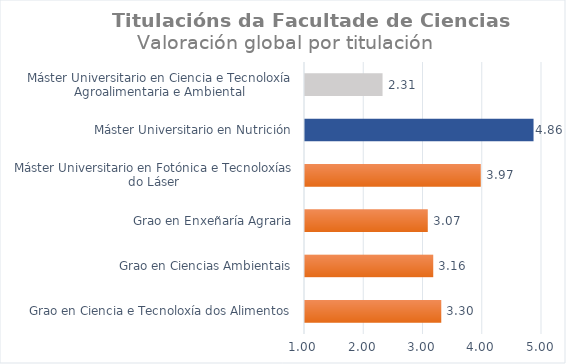
| Category | Series 0 |
|---|---|
| Grao en Ciencia e Tecnoloxía dos Alimentos | 3.3 |
| Grao en Ciencias Ambientais | 3.164 |
| Grao en Enxeñaría Agraria | 3.072 |
| Máster Universitario en Fotónica e Tecnoloxías do Láser | 3.967 |
| Máster Universitario en Nutrición | 4.857 |
| Máster Universitario en Ciencia e Tecnoloxía Agroalimentaria e Ambiental | 2.309 |